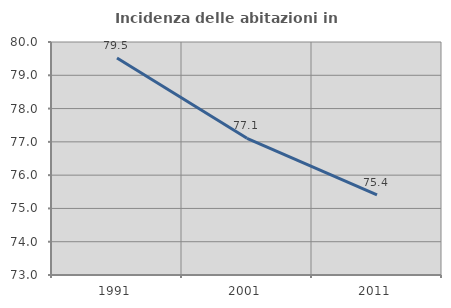
| Category | Incidenza delle abitazioni in proprietà  |
|---|---|
| 1991.0 | 79.519 |
| 2001.0 | 77.108 |
| 2011.0 | 75.404 |